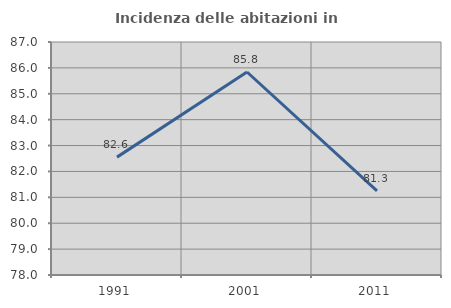
| Category | Incidenza delle abitazioni in proprietà  |
|---|---|
| 1991.0 | 82.553 |
| 2001.0 | 85.841 |
| 2011.0 | 81.25 |